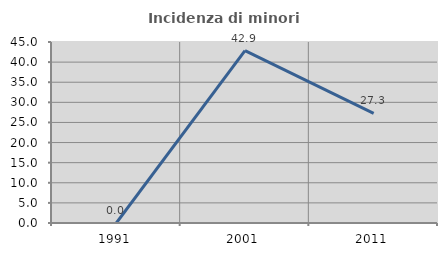
| Category | Incidenza di minori stranieri |
|---|---|
| 1991.0 | 0 |
| 2001.0 | 42.857 |
| 2011.0 | 27.273 |